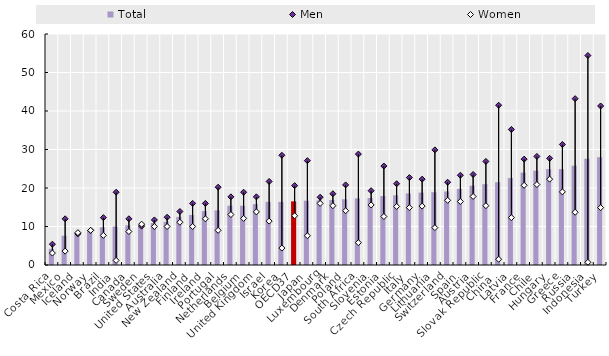
| Category | Total |
|---|---|
| Costa Rica | 4.2 |
| Mexico | 7.6 |
| Iceland | 8.2 |
| Norway | 9 |
| Brazil | 9.8 |
| India | 10 |
| Canada | 10.3 |
| Sweden | 10.4 |
| United States | 10.9 |
| Australia | 11.2 |
| New Zealand | 12.5 |
| Finland | 13 |
| Ireland | 14 |
| Portugal | 14.2 |
| Netherlands | 15.4 |
| Belgium | 15.4 |
| United Kingdom | 15.8 |
| Israel | 16.4 |
| Korea | 16.4 |
| OECD37 | 16.526 |
| Japan | 16.7 |
| Luxembourg | 16.8 |
| Denmark | 16.9 |
| Poland | 17.1 |
| South Africa | 17.3 |
| Slovenia | 17.4 |
| Estonia | 17.9 |
| Czech Republic | 18.1 |
| Italy | 18.6 |
| Germany | 18.8 |
| Lithuania | 18.9 |
| Switzerland | 19.1 |
| Spain | 19.78 |
| Austria | 20.6 |
| Slovak Republic | 21 |
| China  | 21.5 |
| Latvia | 22.6 |
| France | 24 |
| Chile | 24.5 |
| Hungary | 24.9 |
| Greece | 24.9 |
| Russia | 25.8 |
| Indonesia | 27.6 |
| Turkey | 28 |